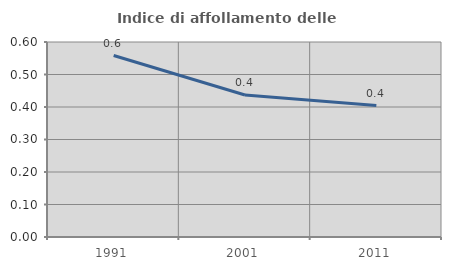
| Category | Indice di affollamento delle abitazioni  |
|---|---|
| 1991.0 | 0.558 |
| 2001.0 | 0.437 |
| 2011.0 | 0.404 |